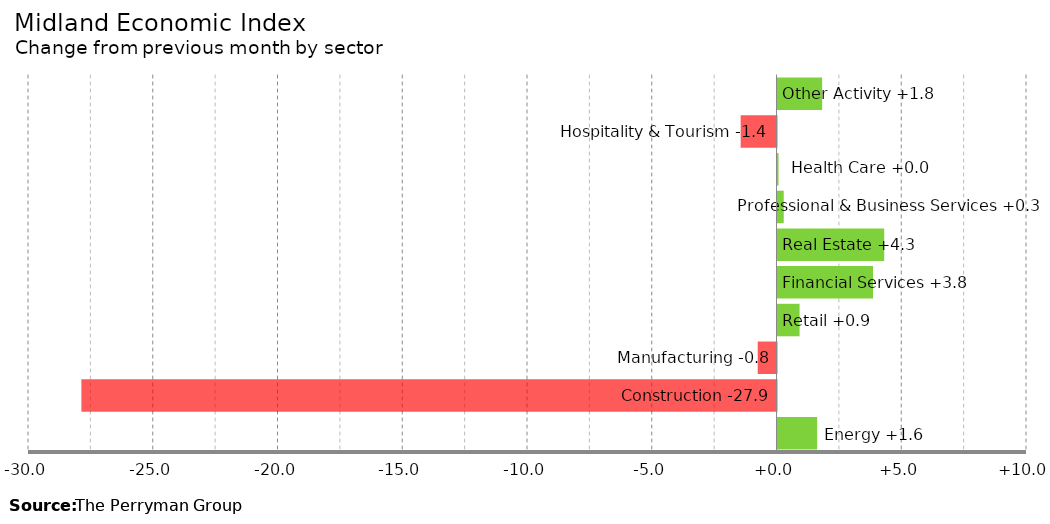
| Category | Change |
|---|---|
| Energy | 1.589 |
| Construction | -27.86 |
| Manufacturing | -0.753 |
| Retail | 0.885 |
| Financial Services | 3.829 |
| Real Estate | 4.277 |
| Professional & Business Services | 0.25 |
| Health Care | 0.041 |
| Hospitality & Tourism | -1.437 |
| Other Activity | 1.79 |